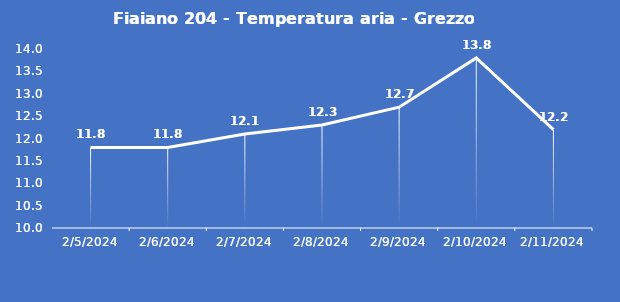
| Category | Fiaiano 204 - Temperatura aria - Grezzo (°C) |
|---|---|
| 2/5/24 | 11.8 |
| 2/6/24 | 11.8 |
| 2/7/24 | 12.1 |
| 2/8/24 | 12.3 |
| 2/9/24 | 12.7 |
| 2/10/24 | 13.8 |
| 2/11/24 | 12.2 |